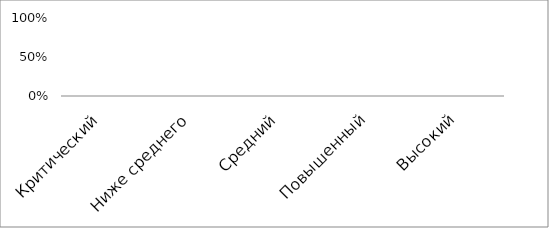
| Category | Series 0 |
|---|---|
| Критический | 0 |
| Ниже среднего | 0 |
| Средний | 0 |
| Повышенный | 0 |
| Высокий | 0 |